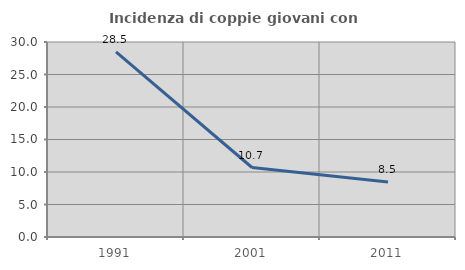
| Category | Incidenza di coppie giovani con figli |
|---|---|
| 1991.0 | 28.472 |
| 2001.0 | 10.692 |
| 2011.0 | 8.475 |